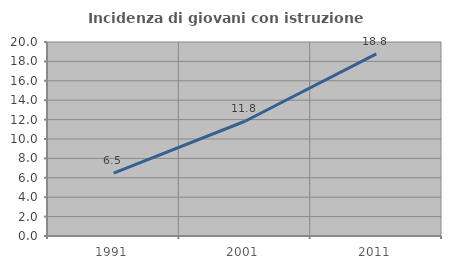
| Category | Incidenza di giovani con istruzione universitaria |
|---|---|
| 1991.0 | 6.475 |
| 2001.0 | 11.829 |
| 2011.0 | 18.781 |